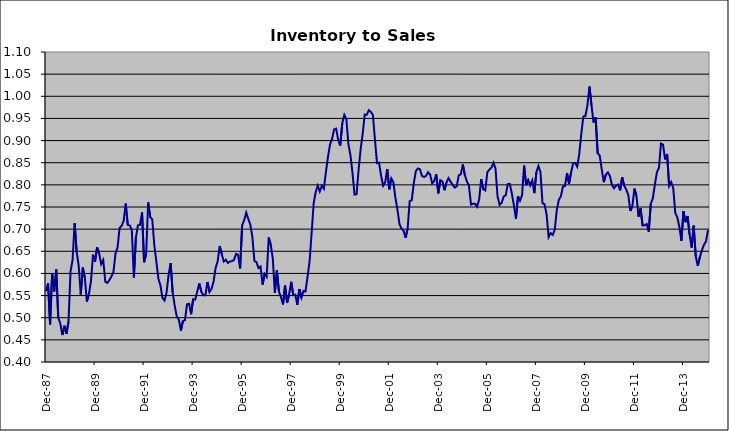
| Category | Series 0 |
|---|---|
| 1983-12-01 | 0.56 |
| 1984-01-01 | 0.578 |
| 1984-02-01 | 0.485 |
| 1984-03-01 | 0.601 |
| 1984-04-01 | 0.559 |
| 1984-05-01 | 0.609 |
| 1984-06-01 | 0.5 |
| 1984-07-01 | 0.487 |
| 1984-08-01 | 0.461 |
| 1984-09-01 | 0.482 |
| 1984-10-01 | 0.464 |
| 1984-11-01 | 0.491 |
| 1984-12-01 | 0.605 |
| 1985-01-01 | 0.63 |
| 1985-02-01 | 0.713 |
| 1985-03-01 | 0.648 |
| 1985-04-01 | 0.617 |
| 1985-05-01 | 0.553 |
| 1985-06-01 | 0.613 |
| 1985-07-01 | 0.59 |
| 1985-08-01 | 0.536 |
| 1985-09-01 | 0.553 |
| 1985-10-01 | 0.582 |
| 1985-11-01 | 0.642 |
| 1985-12-01 | 0.627 |
| 1986-01-01 | 0.659 |
| 1986-02-01 | 0.645 |
| 1986-03-01 | 0.621 |
| 1986-04-01 | 0.63 |
| 1986-05-01 | 0.582 |
| 1986-06-01 | 0.579 |
| 1986-07-01 | 0.585 |
| 1986-08-01 | 0.593 |
| 1986-09-01 | 0.603 |
| 1986-10-01 | 0.645 |
| 1986-11-01 | 0.658 |
| 1986-12-01 | 0.702 |
| 1987-01-01 | 0.708 |
| 1987-02-01 | 0.718 |
| 1987-03-01 | 0.758 |
| 1987-04-01 | 0.71 |
| 1987-05-01 | 0.708 |
| 1987-06-01 | 0.697 |
| 1987-07-01 | 0.591 |
| 1987-08-01 | 0.681 |
| 1987-09-01 | 0.709 |
| 1987-10-01 | 0.71 |
| 1987-11-01 | 0.738 |
| 1987-12-01 | 0.625 |
| 1988-01-01 | 0.644 |
| 1988-02-01 | 0.76 |
| 1988-03-01 | 0.727 |
| 1988-04-01 | 0.722 |
| 1988-05-01 | 0.664 |
| 1988-06-01 | 0.627 |
| 1988-07-01 | 0.588 |
| 1988-08-01 | 0.573 |
| 1988-09-01 | 0.545 |
| 1988-10-01 | 0.539 |
| 1988-11-01 | 0.557 |
| 1988-12-01 | 0.597 |
| 1989-01-01 | 0.623 |
| 1989-02-01 | 0.556 |
| 1989-03-01 | 0.527 |
| 1989-04-01 | 0.502 |
| 1989-05-01 | 0.496 |
| 1989-06-01 | 0.471 |
| 1989-07-01 | 0.492 |
| 1989-08-01 | 0.494 |
| 1989-09-01 | 0.53 |
| 1989-10-01 | 0.532 |
| 1989-11-01 | 0.508 |
| 1989-12-01 | 0.542 |
| 1990-01-01 | 0.541 |
| 1990-02-01 | 0.559 |
| 1990-03-01 | 0.577 |
| 1990-04-01 | 0.559 |
| 1990-05-01 | 0.551 |
| 1990-06-01 | 0.551 |
| 1990-07-01 | 0.581 |
| 1990-08-01 | 0.558 |
| 1990-09-01 | 0.565 |
| 1990-10-01 | 0.581 |
| 1990-11-01 | 0.612 |
| 1990-12-01 | 0.627 |
| 1991-01-01 | 0.662 |
| 1991-02-01 | 0.644 |
| 1991-03-01 | 0.627 |
| 1991-04-01 | 0.631 |
| 1991-05-01 | 0.624 |
| 1991-06-01 | 0.627 |
| 1991-07-01 | 0.628 |
| 1991-08-01 | 0.631 |
| 1991-09-01 | 0.644 |
| 1991-10-01 | 0.642 |
| 1991-11-01 | 0.611 |
| 1991-12-01 | 0.709 |
| 1992-01-01 | 0.72 |
| 1992-02-01 | 0.737 |
| 1992-03-01 | 0.723 |
| 1992-04-01 | 0.71 |
| 1992-05-01 | 0.683 |
| 1992-06-01 | 0.628 |
| 1992-07-01 | 0.626 |
| 1992-08-01 | 0.612 |
| 1992-09-01 | 0.616 |
| 1992-10-01 | 0.575 |
| 1992-11-01 | 0.599 |
| 1992-12-01 | 0.592 |
| 1993-01-01 | 0.681 |
| 1993-02-01 | 0.665 |
| 1993-03-01 | 0.633 |
| 1993-04-01 | 0.556 |
| 1993-05-01 | 0.607 |
| 1993-06-01 | 0.559 |
| 1993-07-01 | 0.547 |
| 1993-08-01 | 0.53 |
| 1993-09-01 | 0.573 |
| 1993-10-01 | 0.533 |
| 1993-11-01 | 0.553 |
| 1993-12-01 | 0.581 |
| 1994-01-01 | 0.551 |
| 1994-02-01 | 0.552 |
| 1994-03-01 | 0.529 |
| 1994-04-01 | 0.565 |
| 1994-05-01 | 0.545 |
| 1994-06-01 | 0.561 |
| 1994-07-01 | 0.56 |
| 1994-08-01 | 0.592 |
| 1994-09-01 | 0.627 |
| 1994-10-01 | 0.691 |
| 1994-11-01 | 0.758 |
| 1994-12-01 | 0.784 |
| 1995-01-01 | 0.798 |
| 1995-02-01 | 0.785 |
| 1995-03-01 | 0.798 |
| 1995-04-01 | 0.791 |
| 1995-05-01 | 0.829 |
| 1995-06-01 | 0.863 |
| 1995-07-01 | 0.891 |
| 1995-08-01 | 0.904 |
| 1995-09-01 | 0.925 |
| 1995-10-01 | 0.927 |
| 1995-11-01 | 0.901 |
| 1995-12-01 | 0.889 |
| 1996-01-01 | 0.939 |
| 1996-02-01 | 0.958 |
| 1996-03-01 | 0.949 |
| 1996-04-01 | 0.892 |
| 1996-05-01 | 0.867 |
| 1996-06-01 | 0.827 |
| 1996-07-01 | 0.778 |
| 1996-08-01 | 0.779 |
| 1996-09-01 | 0.834 |
| 1996-10-01 | 0.881 |
| 1996-11-01 | 0.916 |
| 1996-12-01 | 0.959 |
| 1997-01-01 | 0.958 |
| 1997-02-01 | 0.969 |
| 1997-03-01 | 0.965 |
| 1997-04-01 | 0.958 |
| 1997-05-01 | 0.902 |
| 1997-06-01 | 0.849 |
| 1997-07-01 | 0.85 |
| 1997-08-01 | 0.821 |
| 1997-09-01 | 0.798 |
| 1997-10-01 | 0.806 |
| 1997-11-01 | 0.836 |
| 1997-12-01 | 0.79 |
| 1998-01-01 | 0.815 |
| 1998-02-01 | 0.806 |
| 1998-03-01 | 0.771 |
| 1998-04-01 | 0.744 |
| 1998-05-01 | 0.711 |
| 1998-06-01 | 0.701 |
| 1998-07-01 | 0.697 |
| 1998-08-01 | 0.681 |
| 1998-09-01 | 0.702 |
| 1998-10-01 | 0.763 |
| 1998-11-01 | 0.765 |
| 1998-12-01 | 0.803 |
| 1999-01-01 | 0.831 |
| 1999-02-01 | 0.837 |
| 1999-03-01 | 0.835 |
| 1999-04-01 | 0.82 |
| 1999-05-01 | 0.818 |
| 1999-06-01 | 0.82 |
| 1999-07-01 | 0.828 |
| 1999-08-01 | 0.823 |
| 1999-09-01 | 0.803 |
| 1999-10-01 | 0.809 |
| 1999-11-01 | 0.824 |
| 1999-12-01 | 0.781 |
| 2000-01-01 | 0.81 |
| 2000-02-01 | 0.808 |
| 2000-03-01 | 0.788 |
| 2000-04-01 | 0.805 |
| 2000-05-01 | 0.815 |
| 2000-06-01 | 0.807 |
| 2000-07-01 | 0.801 |
| 2000-08-01 | 0.794 |
| 2000-09-01 | 0.796 |
| 2000-10-01 | 0.821 |
| 2000-11-01 | 0.824 |
| 2000-12-01 | 0.846 |
| 2001-01-01 | 0.822 |
| 2001-02-01 | 0.807 |
| 2001-03-01 | 0.798 |
| 2001-04-01 | 0.756 |
| 2001-05-01 | 0.757 |
| 2001-06-01 | 0.757 |
| 2001-07-01 | 0.751 |
| 2001-08-01 | 0.767 |
| 2001-09-01 | 0.813 |
| 2001-10-01 | 0.79 |
| 2001-11-01 | 0.788 |
| 2001-12-01 | 0.829 |
| 2002-01-01 | 0.834 |
| 2002-02-01 | 0.839 |
| 2002-03-01 | 0.85 |
| 2002-04-01 | 0.837 |
| 2002-05-01 | 0.774 |
| 2002-06-01 | 0.755 |
| 2002-07-01 | 0.759 |
| 2002-08-01 | 0.773 |
| 2002-09-01 | 0.777 |
| 2002-10-01 | 0.802 |
| 2002-11-01 | 0.802 |
| 2002-12-01 | 0.78 |
| 2003-01-01 | 0.754 |
| 2003-02-01 | 0.723 |
| 2003-03-01 | 0.774 |
| 2003-04-01 | 0.764 |
| 2003-05-01 | 0.777 |
| 2003-06-01 | 0.844 |
| 2003-07-01 | 0.799 |
| 2003-08-01 | 0.811 |
| 2003-09-01 | 0.799 |
| 2003-10-01 | 0.81 |
| 2003-11-01 | 0.781 |
| 2003-12-01 | 0.828 |
| 2004-01-01 | 0.843 |
| 2004-02-01 | 0.829 |
| 2004-03-01 | 0.759 |
| 2004-04-01 | 0.756 |
| 2004-05-01 | 0.733 |
| 2004-06-01 | 0.682 |
| 2004-07-01 | 0.691 |
| 2004-08-01 | 0.687 |
| 2004-09-01 | 0.699 |
| 2004-10-01 | 0.743 |
| 2004-11-01 | 0.766 |
| 2004-12-01 | 0.774 |
| 2005-01-01 | 0.796 |
| 2005-02-01 | 0.797 |
| 2005-03-01 | 0.827 |
| 2005-04-01 | 0.803 |
| 2005-05-01 | 0.828 |
| 2005-06-01 | 0.849 |
| 2005-07-01 | 0.85 |
| 2005-08-01 | 0.841 |
| 2005-09-01 | 0.87 |
| 2005-10-01 | 0.916 |
| 2005-11-01 | 0.954 |
| 2005-12-01 | 0.955 |
| 2006-01-01 | 0.98 |
| 2006-02-01 | 1.022 |
| 2006-03-01 | 0.979 |
| 2006-04-01 | 0.941 |
| 2006-05-01 | 0.952 |
| 2006-06-01 | 0.872 |
| 2006-07-01 | 0.866 |
| 2006-08-01 | 0.835 |
| 2006-09-01 | 0.806 |
| 2006-10-01 | 0.823 |
| 2006-11-01 | 0.828 |
| 2006-12-01 | 0.82 |
| 2007-01-01 | 0.8 |
| 2007-02-01 | 0.792 |
| 2007-03-01 | 0.798 |
| 2007-04-01 | 0.801 |
| 2007-05-01 | 0.787 |
| 2007-06-01 | 0.817 |
| 2007-07-01 | 0.798 |
| 2007-08-01 | 0.789 |
| 2007-09-01 | 0.777 |
| 2007-10-01 | 0.741 |
| 2007-11-01 | 0.752 |
| 2007-12-01 | 0.791 |
| 2008-01-01 | 0.775 |
| 2008-02-01 | 0.728 |
| 2008-03-01 | 0.747 |
| 2008-04-01 | 0.708 |
| 2008-05-01 | 0.709 |
| 2008-06-01 | 0.711 |
| 2008-07-01 | 0.694 |
| 2008-08-01 | 0.758 |
| 2008-09-01 | 0.769 |
| 2008-10-01 | 0.8 |
| 2008-11-01 | 0.828 |
| 2008-12-01 | 0.839 |
| 2009-01-01 | 0.893 |
| 2009-02-01 | 0.891 |
| 2009-03-01 | 0.857 |
| 2009-04-01 | 0.87 |
| 2009-05-01 | 0.797 |
| 2009-06-01 | 0.806 |
| 2009-07-01 | 0.793 |
| 2009-08-01 | 0.736 |
| 2009-09-01 | 0.726 |
| 2009-10-01 | 0.705 |
| 2009-11-01 | 0.674 |
| 2009-12-01 | 0.741 |
| 2010-01-01 | 0.716 |
| 2010-02-01 | 0.73 |
| 2010-03-01 | 0.687 |
| 2010-04-01 | 0.658 |
| 2010-05-01 | 0.708 |
| 2010-06-01 | 0.639 |
| 2010-07-01 | 0.617 |
| 2010-08-01 | 0.637 |
| 2010-09-01 | 0.652 |
| 2010-10-01 | 0.665 |
| 2010-11-01 | 0.672 |
| 2010-12-01 | 0.698 |